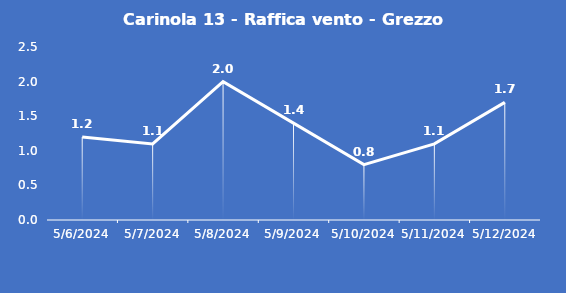
| Category | Carinola 13 - Raffica vento - Grezzo (m/s) |
|---|---|
| 5/6/24 | 1.2 |
| 5/7/24 | 1.1 |
| 5/8/24 | 2 |
| 5/9/24 | 1.4 |
| 5/10/24 | 0.8 |
| 5/11/24 | 1.1 |
| 5/12/24 | 1.7 |